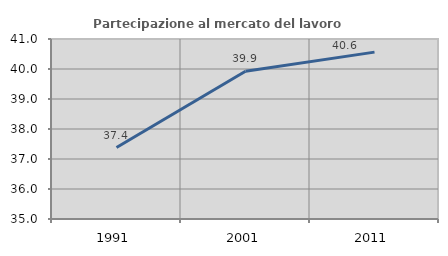
| Category | Partecipazione al mercato del lavoro  femminile |
|---|---|
| 1991.0 | 37.383 |
| 2001.0 | 39.923 |
| 2011.0 | 40.562 |